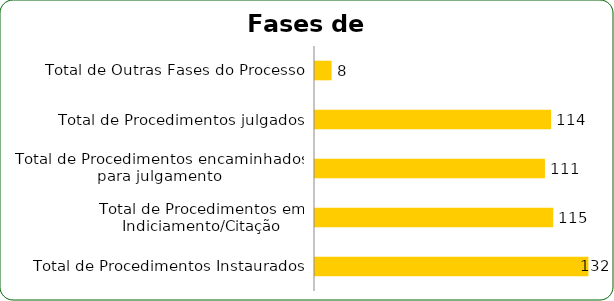
| Category | Series 0 |
|---|---|
| Total de Procedimentos Instaurados | 132 |
| Total de Procedimentos em Indiciamento/Citação | 115 |
| Total de Procedimentos encaminhados para julgamento | 111 |
| Total de Procedimentos julgados | 114 |
| Total de Outras Fases do Processo | 8 |